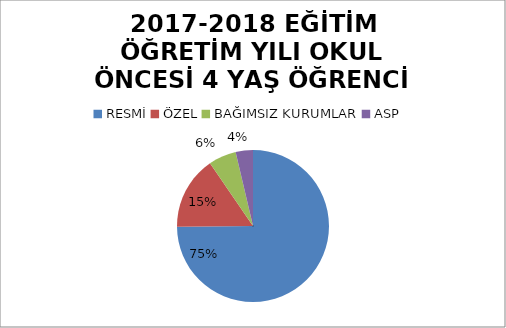
| Category | Series 0 | Series 1 |
|---|---|---|
| RESMİ | 712 |  |
| ÖZEL | 148 |  |
| BAĞIMSIZ KURUMLAR | 56 |  |
| ASP | 35 |  |